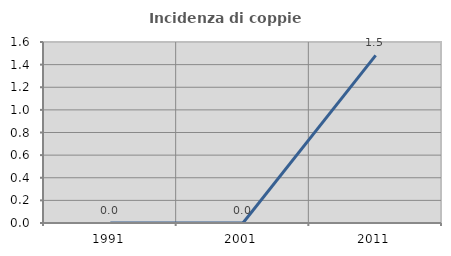
| Category | Incidenza di coppie miste |
|---|---|
| 1991.0 | 0 |
| 2001.0 | 0 |
| 2011.0 | 1.481 |